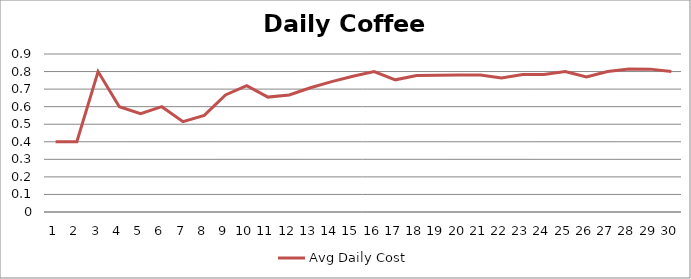
| Category | Avg Daily Cost |
|---|---|
| 0 | 0.4 |
| 1 | 0.4 |
| 2 | 0.8 |
| 3 | 0.6 |
| 4 | 0.56 |
| 5 | 0.6 |
| 6 | 0.514 |
| 7 | 0.55 |
| 8 | 0.667 |
| 9 | 0.72 |
| 10 | 0.655 |
| 11 | 0.667 |
| 12 | 0.708 |
| 13 | 0.743 |
| 14 | 0.773 |
| 15 | 0.8 |
| 16 | 0.753 |
| 17 | 0.778 |
| 18 | 0.779 |
| 19 | 0.78 |
| 20 | 0.781 |
| 21 | 0.764 |
| 22 | 0.783 |
| 23 | 0.783 |
| 24 | 0.8 |
| 25 | 0.769 |
| 26 | 0.8 |
| 27 | 0.814 |
| 28 | 0.814 |
| 29 | 0.8 |